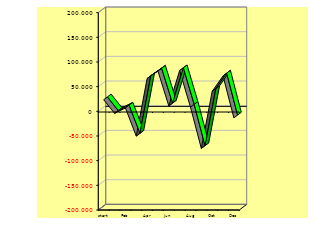
| Category | NEW | Actual |
|---|---|---|
| start.balance | 21459 | 21459 |
| Jan | -6207.667 | -6207.667 |
| Feb | 4792.333 | 4792.333 |
| Mar | -52207.667 | -52207.667 |
| Apr | 64292.333 | 64292.333 |
| May | 79559 | 79559 |
| Jun | 8859 | 8859 |
| Jul | 80459 | 80459 |
| Aug | 6392.333 | 6392.333 |
| Sep | -77207.667 | -77207.667 |
| Oct | 38359 | 38359 |
| Nov | 69625.667 | 69625.667 |
| Dec | -15374.333 | -15374.333 |